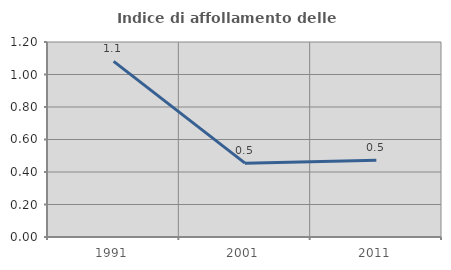
| Category | Indice di affollamento delle abitazioni  |
|---|---|
| 1991.0 | 1.081 |
| 2001.0 | 0.455 |
| 2011.0 | 0.472 |